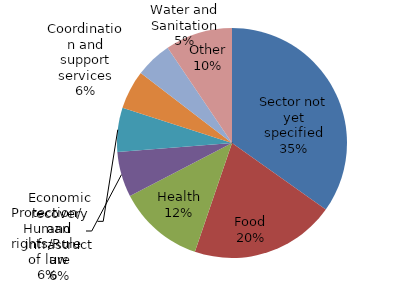
| Category | Series 0 |
|---|---|
| Sector not yet specified | 146.597 |
| Food | 85.835 |
| Health | 51.141 |
| Protection/Human rights/Rule of law | 26.749 |
| Economic recovery and infrastructure | 26.118 |
| Coordination and support services | 23.017 |
| Water and Sanitation | 21.612 |
| Other | 39.778 |